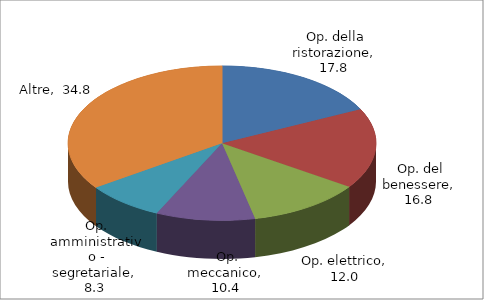
| Category | Series 0 |
|---|---|
| Op. della ristorazione | 17.772 |
| Op. del benessere | 16.787 |
| Op. elettrico | 11.997 |
| Op. meccanico | 10.389 |
| Op. amministrativo - segretariale | 8.29 |
| Altre | 34.765 |